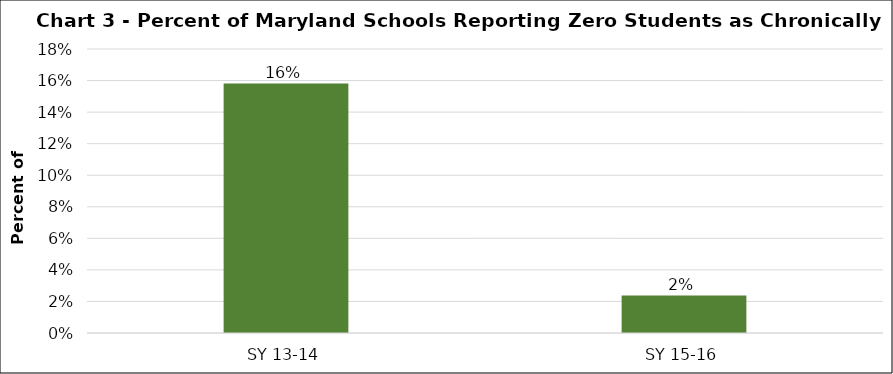
| Category | Series 0 |
|---|---|
| SY 13-14 | 0.158 |
| SY 15-16 | 0.024 |